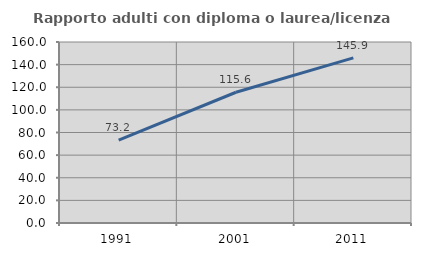
| Category | Rapporto adulti con diploma o laurea/licenza media  |
|---|---|
| 1991.0 | 73.188 |
| 2001.0 | 115.584 |
| 2011.0 | 145.946 |